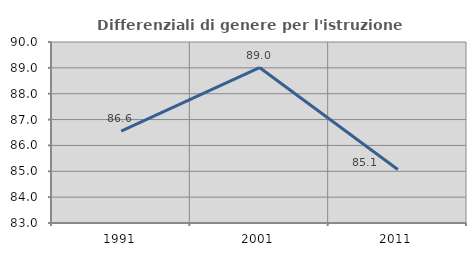
| Category | Differenziali di genere per l'istruzione superiore |
|---|---|
| 1991.0 | 86.557 |
| 2001.0 | 89.012 |
| 2011.0 | 85.069 |